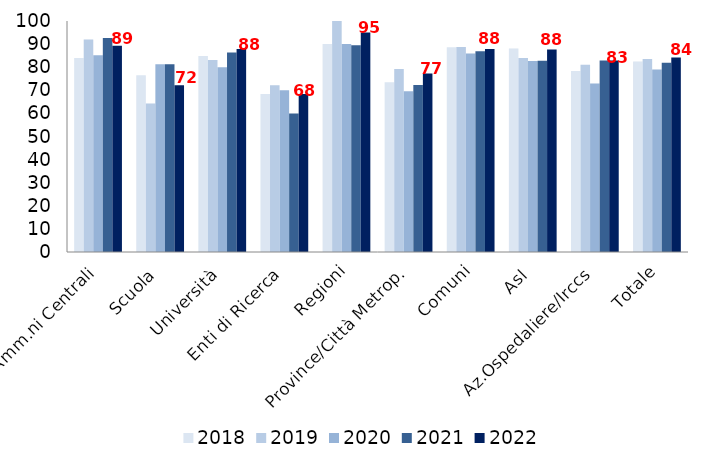
| Category | 2018 | 2019 | 2020 | 2021 | 2022 |
|---|---|---|---|---|---|
| Amm.ni Centrali | 84 | 92 | 85.185 | 92.593 | 89.286 |
| Scuola | 76.471 | 64.286 | 81.25 | 81.25 | 72.222 |
| Università | 84.848 | 83.077 | 80 | 86.364 | 87.879 |
| Enti di Ricerca | 68.421 | 72.222 | 70 | 60 | 68.421 |
| Regioni | 90 | 100 | 90 | 89.474 | 95 |
| Province/Città Metrop. | 73.529 | 79.208 | 69.608 | 72.277 | 77.228 |
| Comuni | 88.679 | 88.785 | 85.981 | 86.916 | 87.85 |
| Asl | 88.119 | 84 | 82.653 | 82.828 | 87.629 |
| Az.Ospedaliere/Irccs | 78.378 | 81.081 | 72.973 | 82.895 | 82.895 |
| Totale | 82.453 | 83.556 | 79.017 | 81.921 | 84.211 |